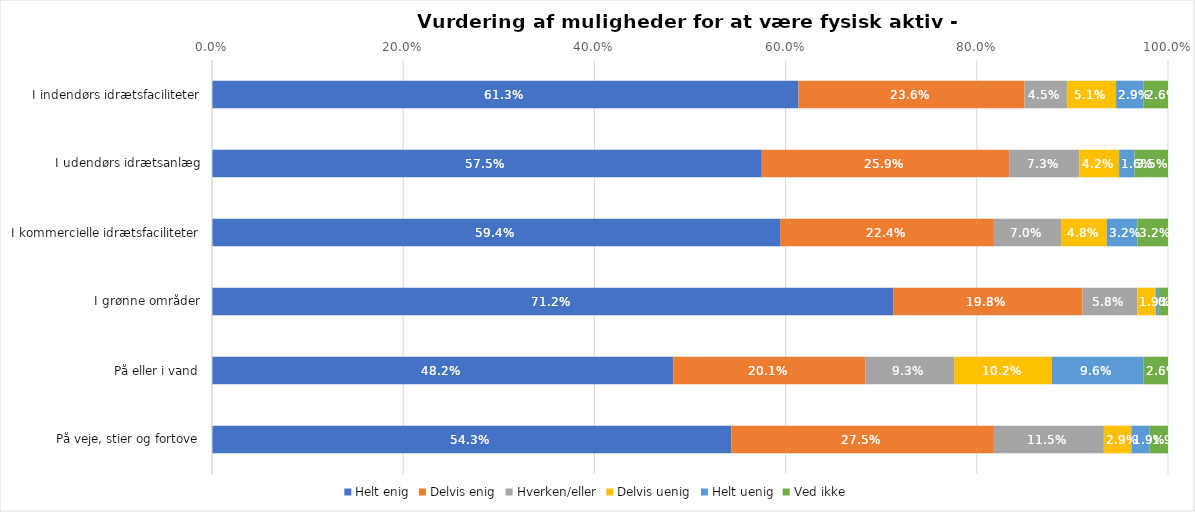
| Category | Helt enig | Delvis enig | Hverken/eller | Delvis uenig | Helt uenig | Ved ikke |
|---|---|---|---|---|---|---|
| I indendørs idrætsfaciliteter | 0.613 | 0.236 | 0.045 | 0.051 | 0.029 | 0.026 |
| I udendørs idrætsanlæg | 0.575 | 0.259 | 0.073 | 0.042 | 0.016 | 0.035 |
| I kommercielle idrætsfaciliteter | 0.594 | 0.224 | 0.07 | 0.048 | 0.032 | 0.032 |
| I grønne områder | 0.712 | 0.198 | 0.058 | 0.019 | 0.003 | 0.01 |
| På eller i vand | 0.482 | 0.201 | 0.093 | 0.102 | 0.096 | 0.026 |
| På veje, stier og fortove | 0.543 | 0.275 | 0.115 | 0.029 | 0.019 | 0.019 |